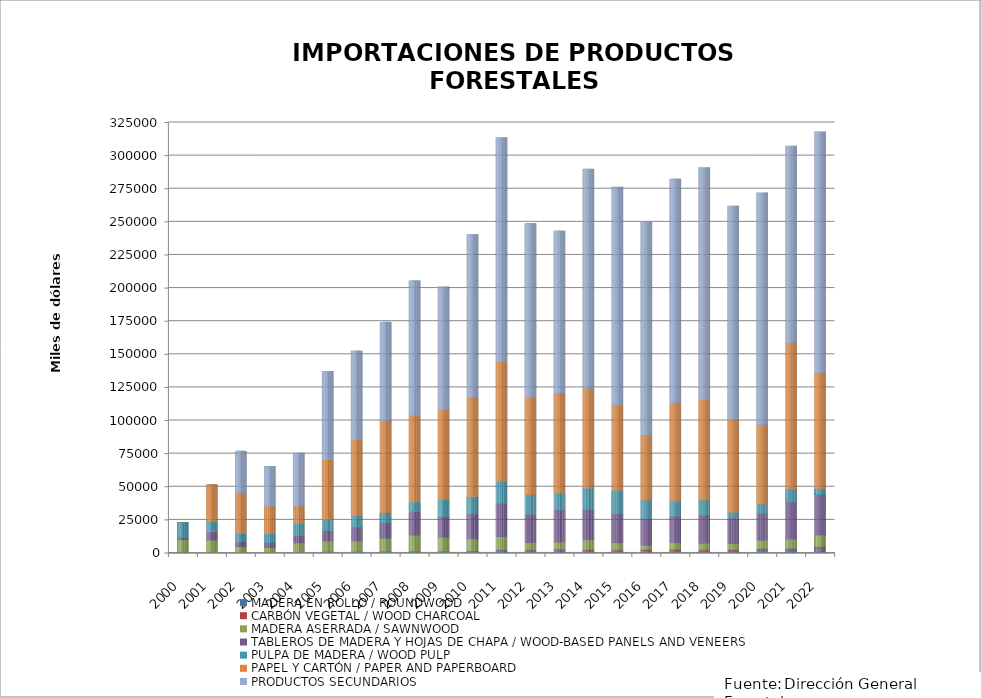
| Category | MADERA EN ROLLO / ROUNDWOOD | CARBÓN VEGETAL / WOOD CHARCOAL | MADERA ASERRADA / SAWNWOOD | TABLEROS DE MADERA Y HOJAS DE CHAPA / WOOD-BASED PANELS AND VENEERS | PULPA DE MADERA / WOOD PULP | PAPEL Y CARTÓN / PAPER AND PAPERBOARD | PRODUCTOS SECUNDARIOS |
|---|---|---|---|---|---|---|---|
| 2000.0 | 226 | 151 | 9300 | 1784 | 11647 | 0 | 0 |
| 2001.0 | 187 | 161 | 8985 | 6504 | 7863 | 28051 | 0 |
| 2002.0 | 51 | 135 | 4200 | 3728 | 6147 | 30904 | 31698 |
| 2003.0 | 116 | 68 | 3478 | 3982 | 6541 | 20845 | 30386 |
| 2004.0 | 281 | 107 | 6589 | 5654 | 9166 | 13437 | 40255 |
| 2005.0 | 554 | 108 | 8074 | 7899 | 8295 | 45465 | 66696 |
| 2006.0 | 663 | 116 | 7931 | 10636 | 8402 | 57793 | 66986 |
| 2007.0 | 833 | 181 | 9876 | 11850 | 7304 | 69482 | 74715 |
| 2008.0 | 952 | 287 | 11754 | 18182 | 6991 | 65196 | 102208 |
| 2009.0 | 679 | 402 | 10524 | 15405 | 12875 | 68215 | 92843 |
| 2010.0 | 832 | 449 | 8737 | 19204 | 13041 | 74865 | 123380 |
| 2011.0 | 1976 | 449 | 9612 | 25239 | 16273 | 90773 | 169308 |
| 2012.0 | 1661.963 | 672.99 | 5266.853 | 21327.495 | 14761.288 | 73577.786 | 131538.425 |
| 2013.0 | 2003 | 734.34 | 5300.109 | 24118.905 | 12943.231 | 75496.404 | 122523.389 |
| 2014.0 | 1339.633 | 846.958 | 7233.949 | 23257.741 | 16007.76 | 75362.926 | 165716.968 |
| 2015.0 | 1531.609 | 805.894 | 5137.849 | 22036.274 | 17630.031 | 64357.034 | 164714.823 |
| 2016.0 | 1443.902 | 1142.393 | 2730.517 | 20484.862 | 13956.154 | 49144.708 | 161015.806 |
| 2017.0 | 1427.423 | 1136.339 | 4801.811 | 20227.24 | 10809.429 | 74795.809 | 169176.457 |
| 2018.0 | 1002.667 | 1128.512 | 4937.372 | 21363.666 | 11347.004 | 75732.412 | 175411.983 |
| 2019.0 | 1254.107 | 1259.625 | 4357.917 | 19197.989 | 4413.051 | 70159.11 | 161242.955 |
| 2020.0 | 1983.078 | 1115.824 | 6125.225 | 20129.559 | 7305.523 | 59845.154 | 175439.77 |
| 2021.0 | 2144 | 1268 | 6888.28 | 27939.709 | 9722.898 | 110675.695 | 148552.384 |
| 2022.0 | 3074.353 | 1521.997 | 8444.437 | 30671.3 | 4638.852 | 87603.932 | 181969.746 |